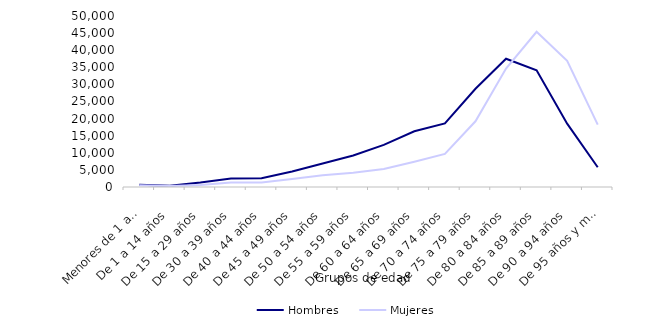
| Category | Hombres | Mujeres |
|---|---|---|
| Menores de 1 año | 634 | 530 |
| De 1 a 14 años | 378 | 322 |
| De 15 a 29 años | 1290 | 550 |
| De 30 a 39 años | 2460 | 1318 |
| De 40 a 44 años | 2531 | 1343 |
| De 45 a 49 años | 4558 | 2330 |
| De 50 a 54 años | 6887 | 3403 |
| De 55 a 59 años | 9206 | 4191 |
| De 60 a 64 años | 12309 | 5244 |
| De 65 a 69 años | 16305 | 7357 |
| De 70 a 74 años | 18607 | 9659 |
| De 75 a 79 años | 28719 | 19209 |
| De 80 a 84 años | 37516 | 34626 |
| De 85 a 89 años | 34131 | 45388 |
| De 90 a 94 años | 18529 | 36872 |
| De 95 años y más | 5774 | 18243 |